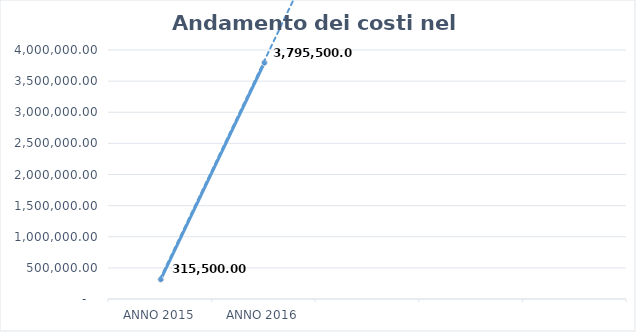
| Category | Series 0 |
|---|---|
| ANNO 2015 | 315500 |
| ANNO 2016 | 3795500 |